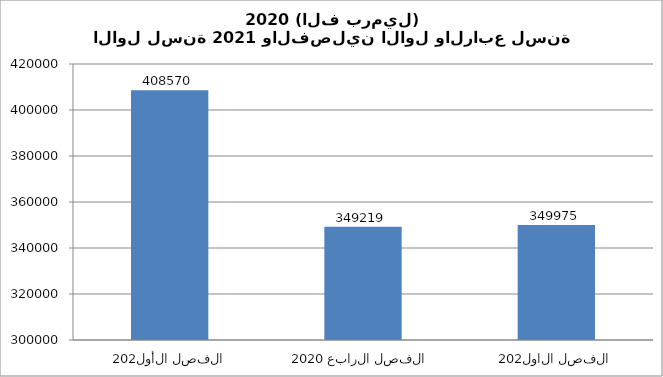
| Category | Series 0 |
|---|---|
| الفصل الأول 2020 | 408570 |
| الفصل الرابع 2020 | 349219 |
| الفصل الاول 2021 | 349975 |